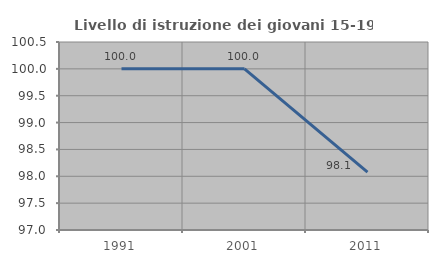
| Category | Livello di istruzione dei giovani 15-19 anni |
|---|---|
| 1991.0 | 100 |
| 2001.0 | 100 |
| 2011.0 | 98.077 |